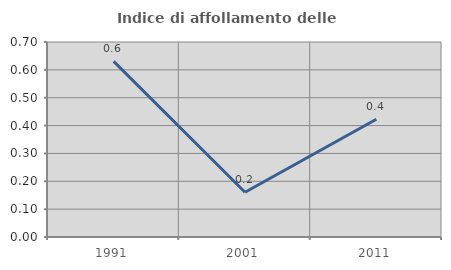
| Category | Indice di affollamento delle abitazioni  |
|---|---|
| 1991.0 | 0.631 |
| 2001.0 | 0.161 |
| 2011.0 | 0.422 |